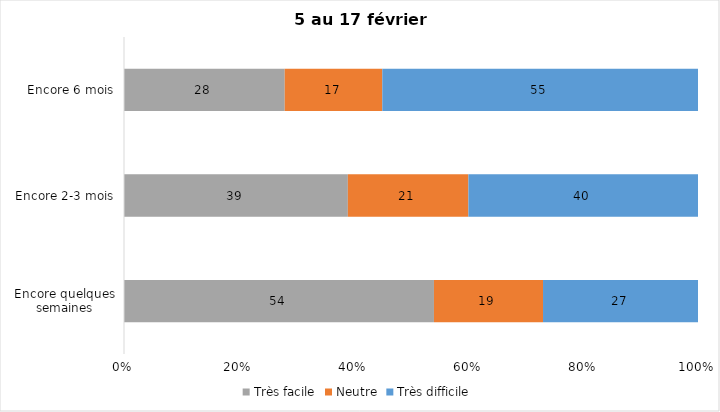
| Category | Très facile | Neutre | Très difficile |
|---|---|---|---|
| Encore quelques semaines | 54 | 19 | 27 |
| Encore 2-3 mois | 39 | 21 | 40 |
| Encore 6 mois | 28 | 17 | 55 |